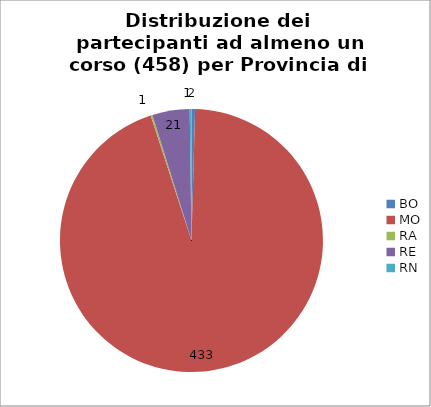
| Category | Nr. Tesserati |
|---|---|
| BO | 2 |
| MO | 433 |
| RA | 1 |
| RE | 21 |
| RN | 1 |